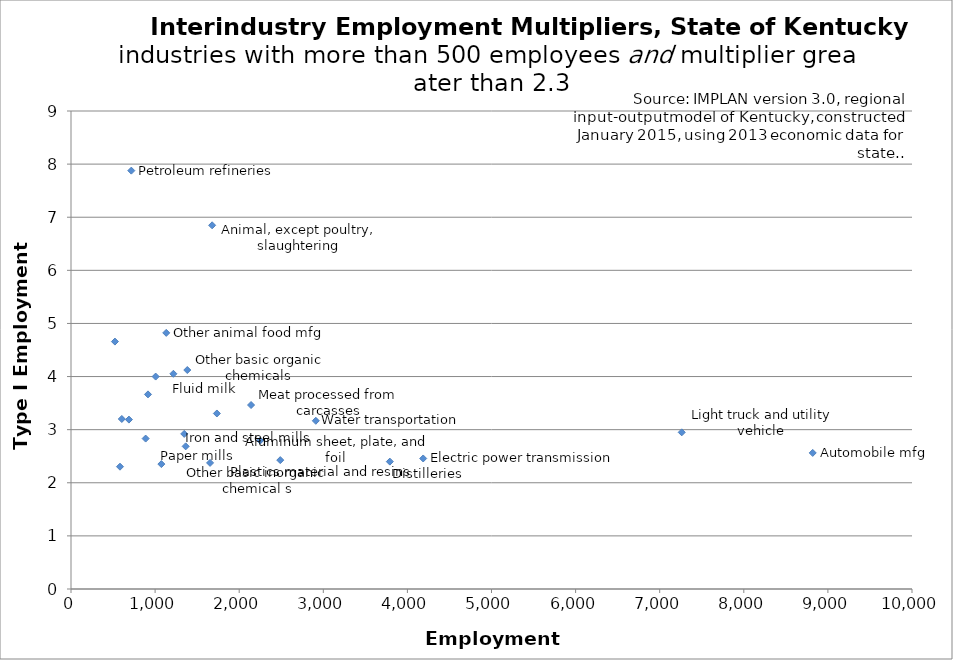
| Category | Series 0 |
|---|---|
| 717.1705932617188 | 7.877 |
| 1678.189208984375 | 6.848 |
| 1132.41748046875 | 4.822 |
| 522.2218017578125 | 4.658 |
| 1382.6131591796875 | 4.123 |
| 1217.498291015625 | 4.052 |
| 1006.7810668945312 | 4 |
| 915.4130859375 | 3.664 |
| 2140.923583984375 | 3.464 |
| 1734.53173828125 | 3.305 |
| 604.025146484375 | 3.201 |
| 688.904296875 | 3.19 |
| 2910.875 | 3.167 |
| 7261.9541015625 | 2.95 |
| 1346.0555419921875 | 2.92 |
| 887.6707153320312 | 2.832 |
| 2249.26416015625 | 2.794 |
| 1363.509765625 | 2.686 |
| 8819.580078125 | 2.562 |
| 4187.93798828125 | 2.458 |
| 2488.134521484375 | 2.427 |
| 3791.22412109375 | 2.398 |
| 1653.604248046875 | 2.374 |
| 1074.333740234375 | 2.352 |
| 582.60546875 | 2.303 |